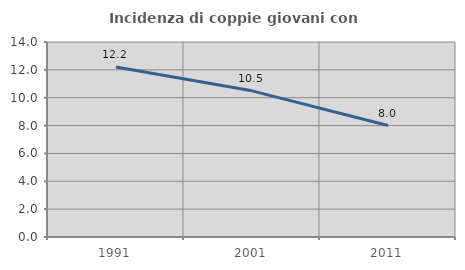
| Category | Incidenza di coppie giovani con figli |
|---|---|
| 1991.0 | 12.209 |
| 2001.0 | 10.494 |
| 2011.0 | 8 |